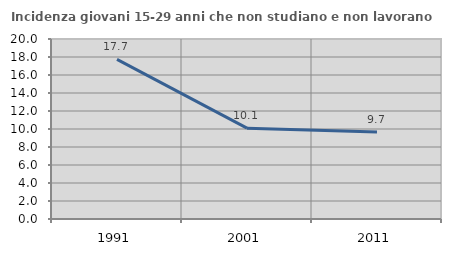
| Category | Incidenza giovani 15-29 anni che non studiano e non lavorano  |
|---|---|
| 1991.0 | 17.734 |
| 2001.0 | 10.09 |
| 2011.0 | 9.657 |